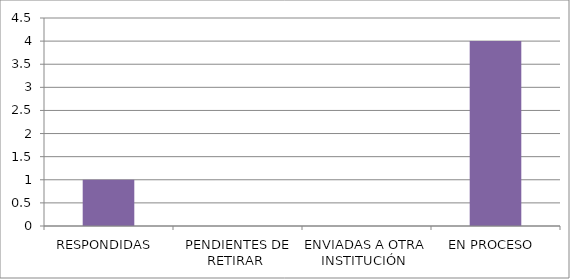
| Category | Series 0 |
|---|---|
| RESPONDIDAS  | 1 |
| PENDIENTES DE RETIRAR  | 0 |
| ENVIADAS A OTRA INSTITUCIÓN  | 0 |
| EN PROCESO  | 4 |